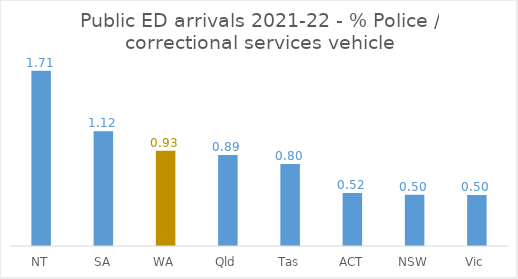
| Category | Public ED arrivals 2021-22 - % Police / correctional services vehicle |
|---|---|
| NT | 1.714 |
| SA | 1.123 |
| WA | 0.932 |
| Qld | 0.891 |
| Tas | 0.802 |
| ACT | 0.518 |
| NSW | 0.502 |
| Vic | 0.499 |